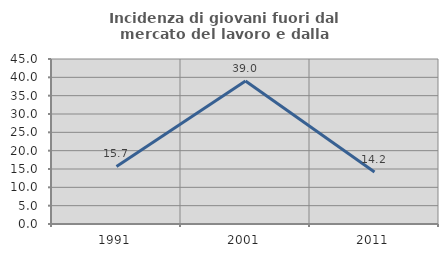
| Category | Incidenza di giovani fuori dal mercato del lavoro e dalla formazione  |
|---|---|
| 1991.0 | 15.714 |
| 2001.0 | 39 |
| 2011.0 | 14.159 |